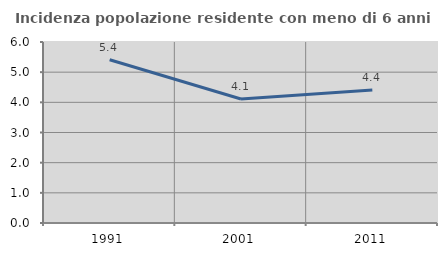
| Category | Incidenza popolazione residente con meno di 6 anni |
|---|---|
| 1991.0 | 5.411 |
| 2001.0 | 4.109 |
| 2011.0 | 4.408 |